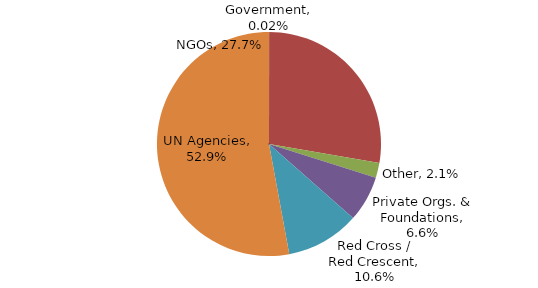
| Category | Series 0 |
|---|---|
| Government | 0 |
| NGOs | 0.277 |
| Other | 0.021 |
| Private Orgs. & Foundations | 0.066 |
| Red Cross / Red Crescent | 0.106 |
| UN Agencies | 0.529 |